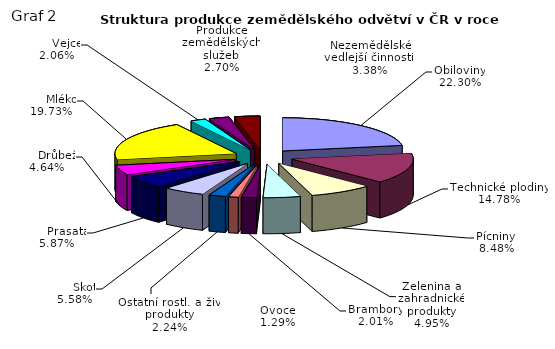
| Category | Series 0 | Series 1 |
|---|---|---|
| Obiloviny | 30263.53 | 30263.53 |
| Technické plodiny | 20058.765 | 20058.765 |
| Pícniny | 11503.92 | 11503.92 |
| Zelenina a zahradnické produkty | 6720.205 | 6720.205 |
| Brambory | 2729.272 | 2729.272 |
| Ovoce | 1744.643 | 1744.643 |
| Ostatní rostl. a živ. produkty | 3045.05 | 3045.05 |
|      Skot | 7570.144 | 7570.144 |
|      Prasata | 7961.411 | 7961.411 |
|      Drůbež | 6290.223 | 6290.223 |
|      Mléko | 26763.269 | 26763.269 |
|      Vejce | 2789.715 | 2789.715 |
| Produkce zemědělských služeb | 3657.389 | 3657.389 |
| Nezemědělské vedlejší činnosti  | 4584.155 | 4584.155 |